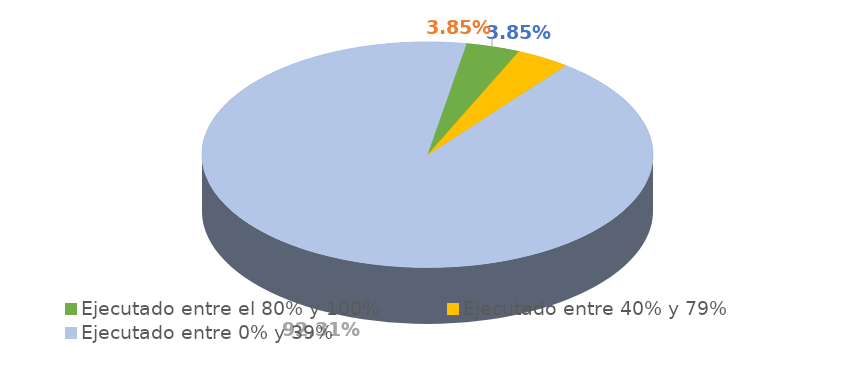
| Category | Series 0 |
|---|---|
| Ejecutado entre el 80% y 100% | 0.038 |
| Ejecutado entre 40% y 79% | 0.038 |
| Ejecutado entre 0% y 39% | 0.923 |